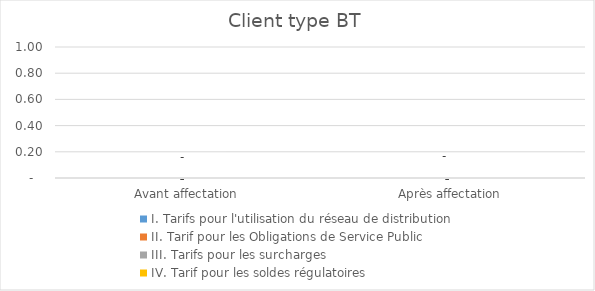
| Category | I. Tarifs pour l'utilisation du réseau de distribution | II. Tarif pour les Obligations de Service Public  | III. Tarifs pour les surcharges   | IV. Tarif pour les soldes régulatoires |
|---|---|---|---|---|
| Avant affectation | 0 | 0 | 0 | 0 |
| Après affectation | 0 | 0 | 0 | 0 |